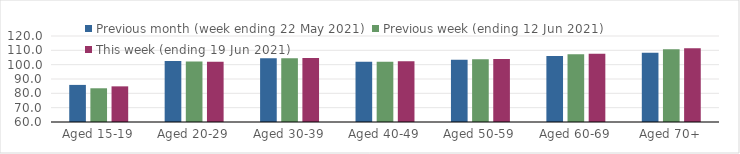
| Category | Previous month (week ending 22 May 2021) | Previous week (ending 12 Jun 2021) | This week (ending 19 Jun 2021) |
|---|---|---|---|
| Aged 15-19 | 85.88 | 83.53 | 84.87 |
| Aged 20-29 | 102.54 | 102.14 | 102.11 |
| Aged 30-39 | 104.49 | 104.54 | 104.62 |
| Aged 40-49 | 102.06 | 102.11 | 102.31 |
| Aged 50-59 | 103.38 | 103.79 | 104 |
| Aged 60-69 | 106.11 | 107.2 | 107.56 |
| Aged 70+ | 108.32 | 110.81 | 111.46 |